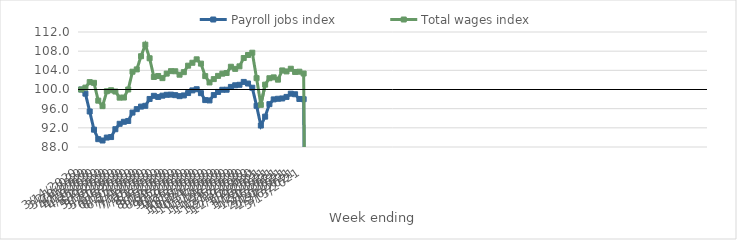
| Category | Payroll jobs index | Total wages index |
|---|---|---|
| 14/03/2020 | 100 | 100 |
| 21/03/2020 | 99.134 | 100.394 |
| 28/03/2020 | 95.409 | 101.542 |
| 04/04/2020 | 91.622 | 101.39 |
| 11/04/2020 | 89.636 | 97.673 |
| 18/04/2020 | 89.353 | 96.531 |
| 25/04/2020 | 89.971 | 99.635 |
| 02/05/2020 | 90.075 | 99.841 |
| 09/05/2020 | 91.711 | 99.573 |
| 16/05/2020 | 92.843 | 98.304 |
| 23/05/2020 | 93.26 | 98.322 |
| 30/05/2020 | 93.434 | 99.999 |
| 06/06/2020 | 95.184 | 103.712 |
| 13/06/2020 | 95.904 | 104.197 |
| 20/06/2020 | 96.432 | 106.945 |
| 27/06/2020 | 96.593 | 109.355 |
| 04/07/2020 | 98.027 | 106.516 |
| 11/07/2020 | 98.68 | 102.617 |
| 18/07/2020 | 98.446 | 102.817 |
| 25/07/2020 | 98.713 | 102.373 |
| 01/08/2020 | 98.896 | 103.317 |
| 08/08/2020 | 98.933 | 103.83 |
| 15/08/2020 | 98.822 | 103.808 |
| 22/08/2020 | 98.614 | 103.088 |
| 29/08/2020 | 98.763 | 103.621 |
| 05/09/2020 | 99.257 | 104.975 |
| 12/09/2020 | 99.812 | 105.576 |
| 19/09/2020 | 100.056 | 106.297 |
| 26/09/2020 | 99.24 | 105.4 |
| 03/10/2020 | 97.791 | 102.795 |
| 10/10/2020 | 97.718 | 101.471 |
| 17/10/2020 | 98.83 | 102.171 |
| 24/10/2020 | 99.494 | 102.843 |
| 31/10/2020 | 99.947 | 103.301 |
| 07/11/2020 | 99.953 | 103.442 |
| 14/11/2020 | 100.541 | 104.751 |
| 21/11/2020 | 100.878 | 104.308 |
| 28/11/2020 | 100.982 | 104.831 |
| 05/12/2020 | 101.583 | 106.569 |
| 12/12/2020 | 101.246 | 107.196 |
| 19/12/2020 | 100.368 | 107.678 |
| 26/12/2020 | 96.598 | 102.368 |
| 02/01/2021 | 92.479 | 96.798 |
| 09/01/2021 | 94.336 | 101.011 |
| 16/01/2021 | 96.942 | 102.356 |
| 23/01/2021 | 97.936 | 102.533 |
| 30/01/2021 | 98.064 | 102.054 |
| 06/02/2021 | 98.128 | 103.979 |
| 13/02/2021 | 98.454 | 103.77 |
| 20/02/2021 | 99.128 | 104.334 |
| 27/02/2021 | 99.007 | 103.662 |
| 06/03/2021 | 98.024 | 103.717 |
| 13/03/2021 | 97.974 | 103.333 |